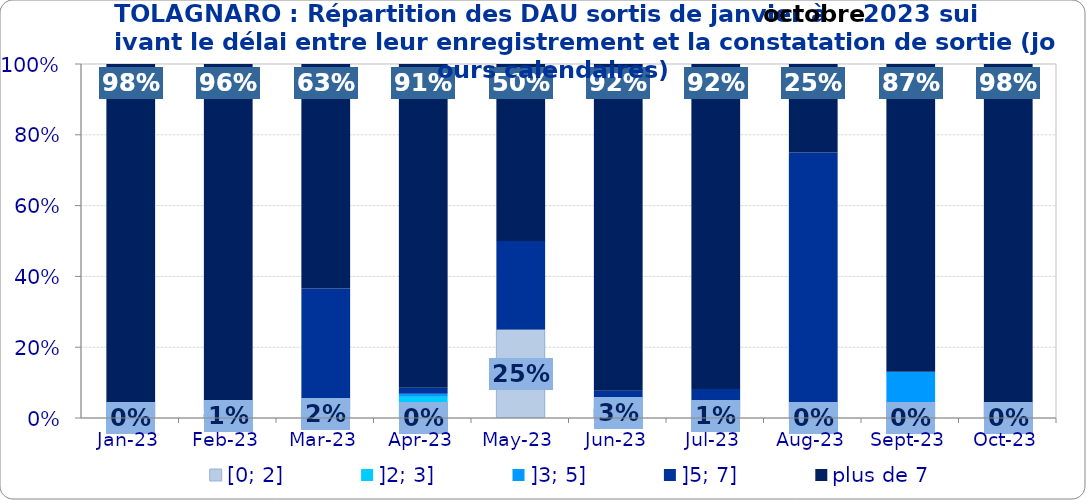
| Category | [0; 2] | ]2; 3] | ]3; 5] | ]5; 7] | plus de 7 |
|---|---|---|---|---|---|
| 2023-01-01 | 0 | 0 | 0 | 0.017 | 0.983 |
| 2023-02-01 | 0.009 | 0 | 0.019 | 0.009 | 0.963 |
| 2023-03-01 | 0.024 | 0 | 0 | 0.341 | 0.634 |
| 2023-04-01 | 0 | 0.06 | 0.009 | 0.017 | 0.915 |
| 2023-05-01 | 0.25 | 0 | 0 | 0.25 | 0.5 |
| 2023-06-01 | 0.026 | 0 | 0 | 0.051 | 0.923 |
| 2023-07-01 | 0.009 | 0 | 0 | 0.073 | 0.918 |
| 2023-08-01 | 0 | 0 | 0 | 0.75 | 0.25 |
| 2023-09-01 | 0 | 0 | 0.13 | 0 | 0.87 |
| 2023-10-01 | 0 | 0 | 0 | 0.019 | 0.981 |